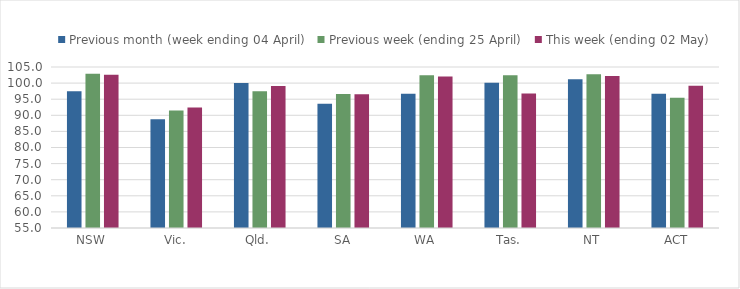
| Category | Previous month (week ending 04 April) | Previous week (ending 25 April) | This week (ending 02 May) |
|---|---|---|---|
| NSW | 97.492 | 102.899 | 102.596 |
| Vic. | 88.807 | 91.49 | 92.387 |
| Qld. | 100 | 97.442 | 99.128 |
| SA | 93.551 | 96.624 | 96.523 |
| WA | 96.657 | 102.439 | 102.012 |
| Tas. | 100.102 | 102.439 | 96.805 |
| NT | 101.186 | 102.714 | 102.194 |
| ACT | 96.724 | 95.455 | 99.193 |